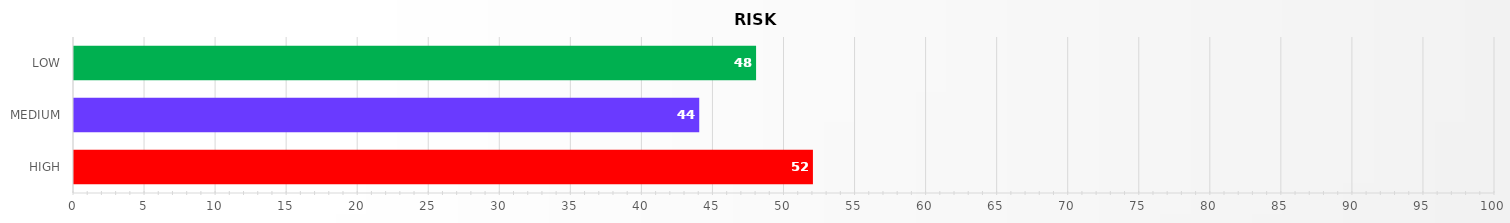
| Category | Series 0 |
|---|---|
| HIGH | 52 |
| MEDIUM | 44 |
| LOW | 48 |